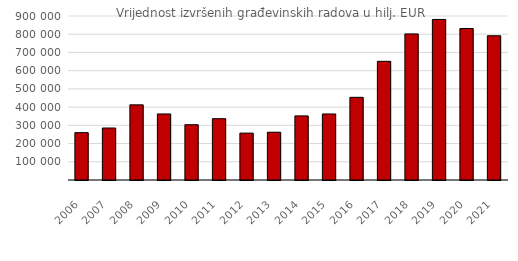
| Category | UKUPNO |
|---|---|
| 2006.0 | 259880 |
| 2007.0 | 285345 |
| 2008.0 | 412352 |
| 2009.0 | 362430 |
| 2010.0 | 303454 |
| 2011.0 | 336484 |
| 2012.0 | 257288 |
| 2013.0 | 262183 |
| 2014.0 | 351834 |
| 2015.0 | 362447 |
| 2016.0 | 453652 |
| 2017.0 | 651364 |
| 2018.0 | 801708 |
| 2019.0 | 880996 |
| 2020.0 | 831184 |
| 2021.0 | 791667 |